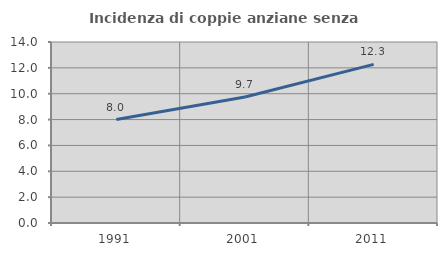
| Category | Incidenza di coppie anziane senza figli  |
|---|---|
| 1991.0 | 8 |
| 2001.0 | 9.746 |
| 2011.0 | 12.272 |